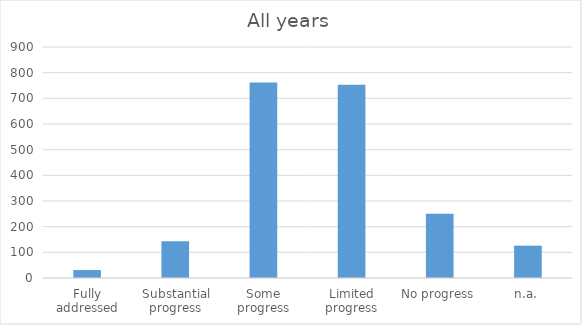
| Category | Total |
|---|---|
| Fully addressed | 31 |
| Substantial progress | 143 |
| Some progress | 762 |
| Limited progress | 753 |
| No progress | 250 |
| n.a. | 126 |